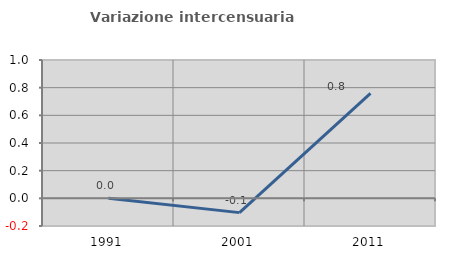
| Category | Variazione intercensuaria annua |
|---|---|
| 1991.0 | 0 |
| 2001.0 | -0.103 |
| 2011.0 | 0.759 |